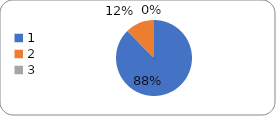
| Category | Series 0 |
|---|---|
| 0 | 85 |
| 1 | 12 |
| 2 | 0 |